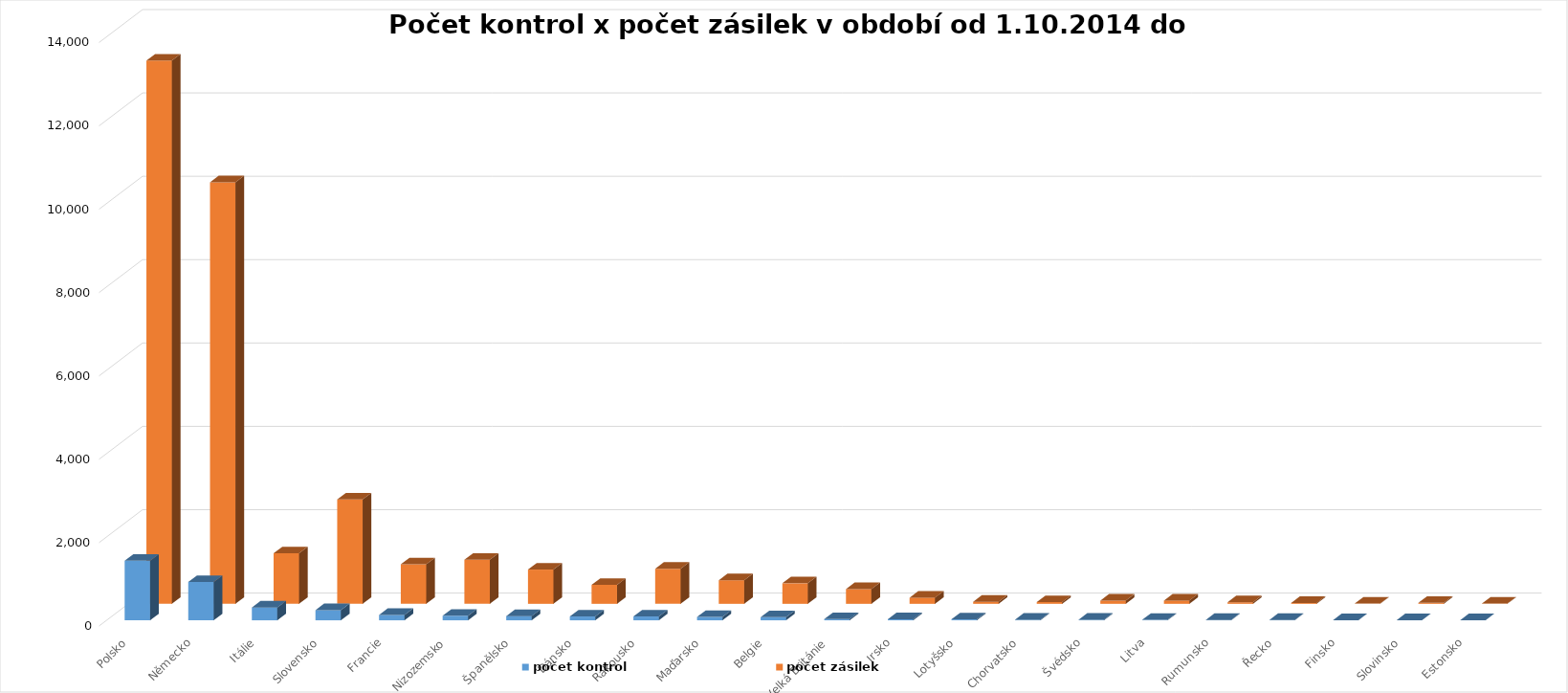
| Category | počet kontrol | počet zásilek |
|---|---|---|
| Polsko | 1430 | 13035 |
| Německo | 918 | 10115 |
| Itálie | 308 | 1211 |
| Slovensko | 243 | 2504 |
| Francie | 128 | 948 |
| Nizozemsko | 109 | 1058 |
| Španělsko | 101 | 822 |
| Dánsko | 92 | 455 |
| Rakousko | 92 | 842 |
| Maďarsko | 80 | 566 |
| Belgie | 73 | 493 |
| Velká Británie | 29 | 353 |
| Irsko | 25 | 148 |
| Lotyšsko | 22 | 49 |
| Chorvatsko | 13 | 42 |
| Švédsko | 13 | 77 |
| Litva | 11 | 79 |
| Rumunsko | 7 | 37 |
| Řecko | 7 | 22 |
| Finsko | 2 | 5 |
| Slovinsko | 2 | 23 |
| Estonsko | 1 | 7 |